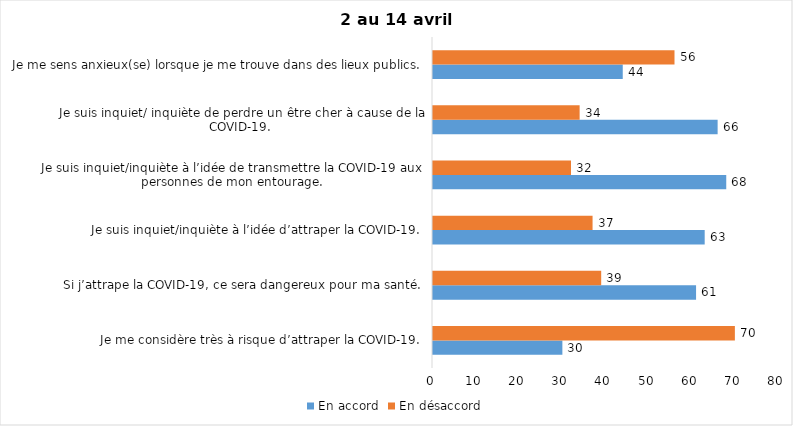
| Category | En accord | En désaccord |
|---|---|---|
| Je me considère très à risque d’attraper la COVID-19. | 30 | 70 |
| Si j’attrape la COVID-19, ce sera dangereux pour ma santé. | 61 | 39 |
| Je suis inquiet/inquiète à l’idée d’attraper la COVID-19. | 63 | 37 |
| Je suis inquiet/inquiète à l’idée de transmettre la COVID-19 aux personnes de mon entourage. | 68 | 32 |
| Je suis inquiet/ inquiète de perdre un être cher à cause de la COVID-19. | 66 | 34 |
| Je me sens anxieux(se) lorsque je me trouve dans des lieux publics. | 44 | 56 |